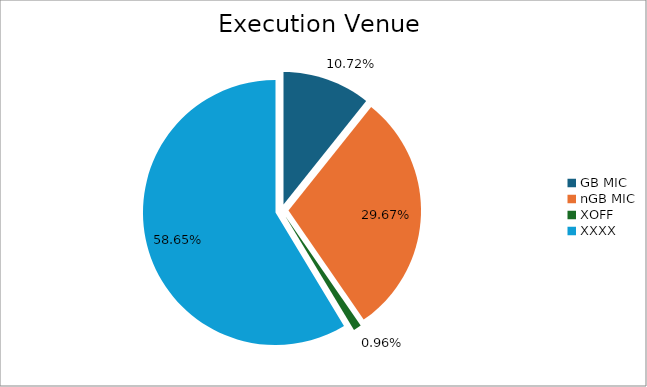
| Category | Series 0 |
|---|---|
| GB MIC | 1149957.519 |
| nGB MIC | 3182975.698 |
| XOFF | 102754.534 |
| XXXX | 6290647.442 |